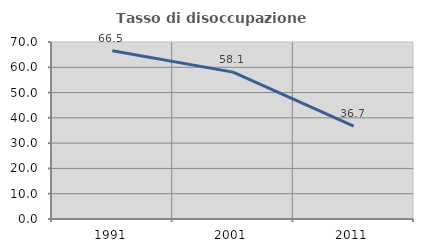
| Category | Tasso di disoccupazione giovanile  |
|---|---|
| 1991.0 | 66.52 |
| 2001.0 | 58.09 |
| 2011.0 | 36.74 |